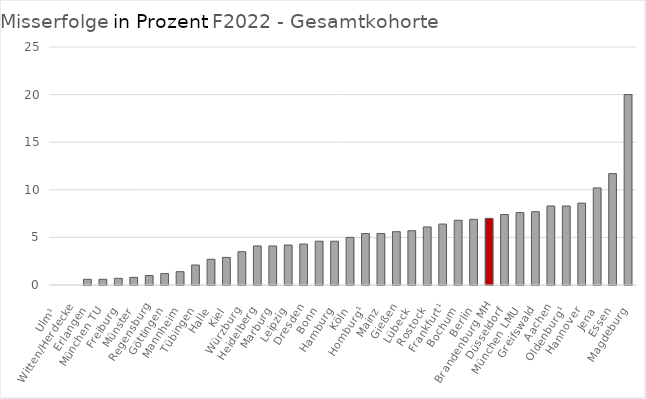
| Category | Misserfolg Ges |
|---|---|
| Ulm¹ | 0 |
| Witten/Herdecke | 0 |
| Erlangen | 0.6 |
| München TU | 0.6 |
| Freiburg | 0.7 |
| Münster | 0.8 |
| Regensburg | 1 |
| Göttingen | 1.2 |
| Mannheim | 1.4 |
| Tübingen | 2.1 |
| Halle | 2.7 |
| Kiel | 2.9 |
| Würzburg | 3.5 |
| Heidelberg | 4.1 |
| Marburg | 4.1 |
| Leipzig | 4.2 |
| Dresden | 4.3 |
| Bonn | 4.6 |
| Hamburg | 4.6 |
| Köln | 5 |
| Homburg¹ | 5.4 |
| Mainz | 5.4 |
| Gießen | 5.6 |
| Lübeck | 5.7 |
| Rostock | 6.1 |
| Frankfurt¹ | 6.4 |
| Bochum | 6.8 |
| Berlin | 6.9 |
| Brandenburg MH | 7 |
| Düsseldorf | 7.4 |
| München LMU | 7.6 |
| Greifswald | 7.7 |
| Aachen | 8.3 |
| Oldenburg¹ | 8.3 |
| Hannover | 8.6 |
| Jena | 10.2 |
| Essen | 11.7 |
| Magdeburg | 20 |